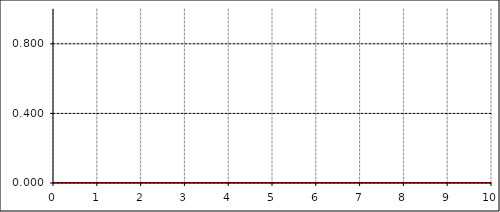
| Category | resopnse of B to a unit innovation in A |
|---|---|
| 0.0 | 0 |
| 1.0 | 0 |
| 2.0 | 0 |
| 3.0 | 0 |
| 4.0 | 0 |
| 5.0 | 0 |
| 6.0 | 0 |
| 7.0 | 0 |
| 8.0 | 0 |
| 9.0 | 0 |
| 10.0 | 0 |